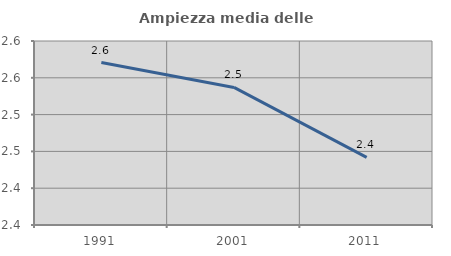
| Category | Ampiezza media delle famiglie |
|---|---|
| 1991.0 | 2.571 |
| 2001.0 | 2.537 |
| 2011.0 | 2.442 |